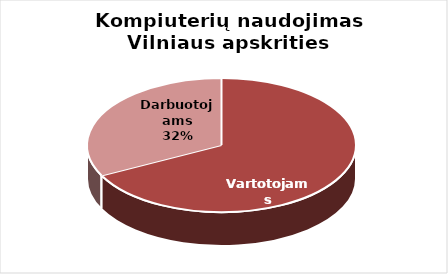
| Category | Series 0 |
|---|---|
| Vartotojams | 819 |
| Darbuotojams | 394 |